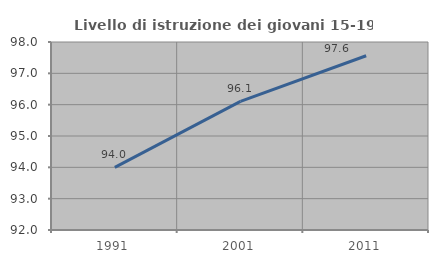
| Category | Livello di istruzione dei giovani 15-19 anni |
|---|---|
| 1991.0 | 94 |
| 2001.0 | 96.104 |
| 2011.0 | 97.561 |